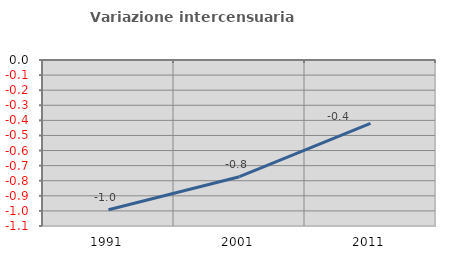
| Category | Variazione intercensuaria annua |
|---|---|
| 1991.0 | -0.992 |
| 2001.0 | -0.773 |
| 2011.0 | -0.42 |